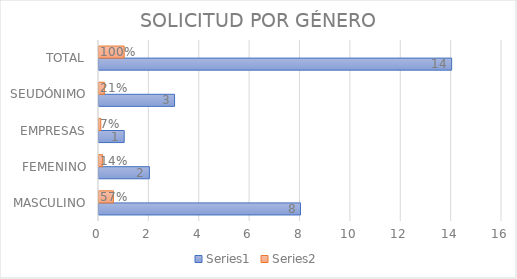
| Category | Series 0 | Series 1 |
|---|---|---|
| MASCULINO | 8 | 0.571 |
| FEMENINO | 2 | 0.143 |
| EMPRESAS | 1 | 0.071 |
| SEUDÓNIMO | 3 | 0.214 |
| TOTAL | 14 | 1 |